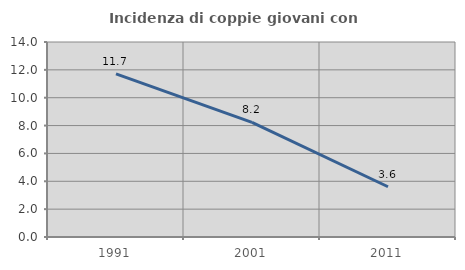
| Category | Incidenza di coppie giovani con figli |
|---|---|
| 1991.0 | 11.706 |
| 2001.0 | 8.228 |
| 2011.0 | 3.607 |